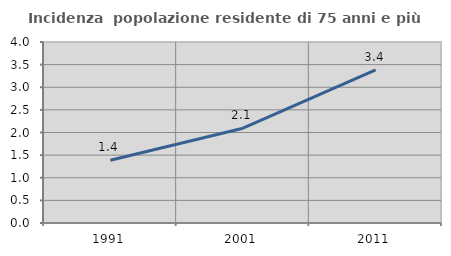
| Category | Incidenza  popolazione residente di 75 anni e più |
|---|---|
| 1991.0 | 1.387 |
| 2001.0 | 2.095 |
| 2011.0 | 3.384 |